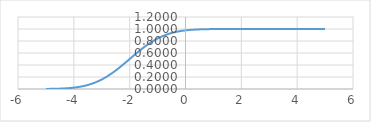
| Category | Series 0 |
|---|---|
| -5.0 | 0.001 |
| -4.9 | 0.002 |
| -4.8 | 0.003 |
| -4.7 | 0.003 |
| -4.6 | 0.005 |
| -4.5 | 0.006 |
| -4.4 | 0.008 |
| -4.3 | 0.011 |
| -4.2 | 0.014 |
| -4.1 | 0.018 |
| -4.0 | 0.023 |
| -3.9 | 0.029 |
| -3.8 | 0.036 |
| -3.7 | 0.045 |
| -3.6 | 0.055 |
| -3.50000000000001 | 0.067 |
| -3.40000000000001 | 0.081 |
| -3.30000000000001 | 0.097 |
| -3.20000000000001 | 0.115 |
| -3.10000000000001 | 0.136 |
| -3.00000000000001 | 0.159 |
| -2.90000000000001 | 0.184 |
| -2.80000000000001 | 0.212 |
| -2.70000000000001 | 0.242 |
| -2.60000000000001 | 0.274 |
| -2.50000000000001 | 0.309 |
| -2.40000000000001 | 0.345 |
| -2.30000000000001 | 0.382 |
| -2.20000000000001 | 0.421 |
| -2.10000000000001 | 0.46 |
| -2.00000000000001 | 0.5 |
| -1.90000000000001 | 0.54 |
| -1.80000000000001 | 0.579 |
| -1.70000000000001 | 0.618 |
| -1.60000000000001 | 0.655 |
| -1.50000000000001 | 0.691 |
| -1.40000000000001 | 0.726 |
| -1.30000000000001 | 0.758 |
| -1.20000000000001 | 0.788 |
| -1.10000000000001 | 0.816 |
| -1.00000000000001 | 0.841 |
| -0.90000000000001 | 0.864 |
| -0.80000000000001 | 0.885 |
| -0.70000000000002 | 0.903 |
| -0.60000000000002 | 0.919 |
| -0.50000000000002 | 0.933 |
| -0.40000000000002 | 0.945 |
| -0.30000000000002 | 0.955 |
| -0.20000000000002 | 0.964 |
| -0.10000000000002 | 0.971 |
| -2.04281036531029e-14 | 0.977 |
| 0.0999999999999801 | 0.982 |
| 0.19999999999998 | 0.986 |
| 0.29999999999998 | 0.989 |
| 0.39999999999998 | 0.992 |
| 0.49999999999998 | 0.994 |
| 0.59999999999998 | 0.995 |
| 0.69999999999998 | 0.997 |
| 0.79999999999998 | 0.997 |
| 0.89999999999998 | 0.998 |
| 0.99999999999998 | 0.999 |
| 1.09999999999998 | 0.999 |
| 1.19999999999998 | 0.999 |
| 1.29999999999998 | 1 |
| 1.39999999999998 | 1 |
| 1.49999999999998 | 1 |
| 1.59999999999998 | 1 |
| 1.69999999999998 | 1 |
| 1.79999999999998 | 1 |
| 1.89999999999998 | 1 |
| 1.99999999999998 | 1 |
| 2.09999999999997 | 1 |
| 2.19999999999997 | 1 |
| 2.29999999999997 | 1 |
| 2.39999999999997 | 1 |
| 2.49999999999997 | 1 |
| 2.59999999999997 | 1 |
| 2.69999999999997 | 1 |
| 2.79999999999997 | 1 |
| 2.89999999999997 | 1 |
| 2.99999999999997 | 1 |
| 3.09999999999997 | 1 |
| 3.19999999999997 | 1 |
| 3.29999999999997 | 1 |
| 3.39999999999997 | 1 |
| 3.49999999999997 | 1 |
| 3.59999999999997 | 1 |
| 3.69999999999997 | 1 |
| 3.79999999999997 | 1 |
| 3.89999999999997 | 1 |
| 3.99999999999997 | 1 |
| 4.09999999999997 | 1 |
| 4.19999999999997 | 1 |
| 4.29999999999997 | 1 |
| 4.39999999999997 | 1 |
| 4.49999999999997 | 1 |
| 4.59999999999997 | 1 |
| 4.69999999999997 | 1 |
| 4.79999999999997 | 1 |
| 4.89999999999996 | 1 |
| 4.99999999999996 | 1 |